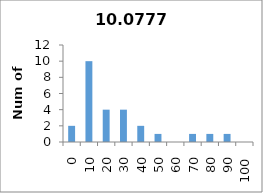
| Category | Frequency |
|---|---|
| 0.0 | 2 |
| 10.0 | 10 |
| 20.0 | 4 |
| 30.0 | 4 |
| 40.0 | 2 |
| 50.0 | 1 |
| 60.0 | 0 |
| 70.0 | 1 |
| 80.0 | 1 |
| 90.0 | 1 |
| 100.0 | 0 |